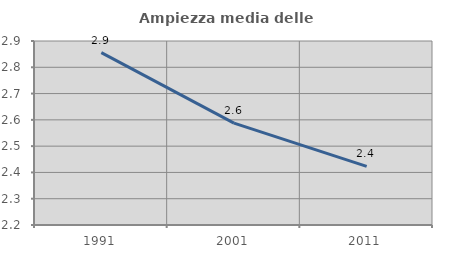
| Category | Ampiezza media delle famiglie |
|---|---|
| 1991.0 | 2.856 |
| 2001.0 | 2.588 |
| 2011.0 | 2.423 |